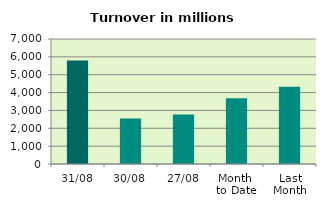
| Category | Series 0 |
|---|---|
| 31/08 | 5791.437 |
| 30/08 | 2545.248 |
| 27/08 | 2769.205 |
| Month 
to Date | 3679.291 |
| Last
Month | 4319.965 |